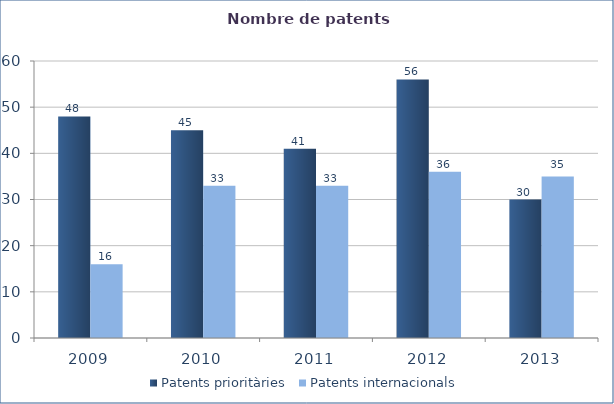
| Category | Patents prioritàries | Patents internacionals |
|---|---|---|
| 2009.0 | 48 | 16 |
| 2010.0 | 45 | 33 |
| 2011.0 | 41 | 33 |
| 2012.0 | 56 | 36 |
| 2013.0 | 30 | 35 |